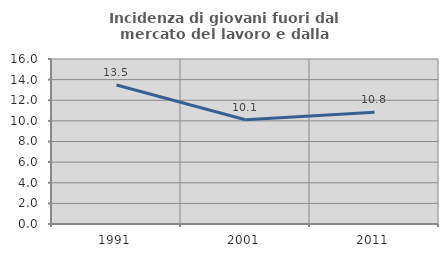
| Category | Incidenza di giovani fuori dal mercato del lavoro e dalla formazione  |
|---|---|
| 1991.0 | 13.483 |
| 2001.0 | 10.112 |
| 2011.0 | 10.843 |